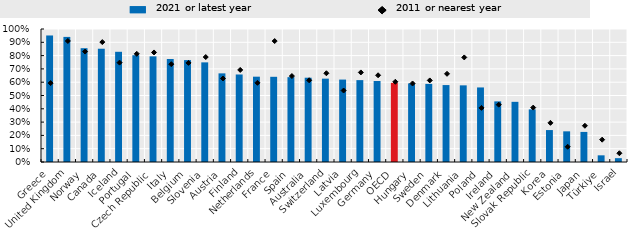
| Category | 2021 or latest year |
|---|---|
| Greece | 0.951 |
| United Kingdom | 0.941 |
| Norway | 0.856 |
| Canada | 0.852 |
| Iceland | 0.829 |
| Portugal | 0.803 |
| Czech Republic | 0.794 |
| Italy | 0.775 |
| Belgium | 0.766 |
| Slovenia | 0.749 |
| Austria | 0.666 |
| Finland | 0.658 |
| Netherlands | 0.642 |
| France | 0.641 |
| Spain | 0.638 |
| Australia | 0.634 |
| Switzerland | 0.627 |
| Latvia | 0.62 |
| Luxembourg | 0.616 |
| Germany | 0.609 |
| OECD | 0.595 |
| Hungary | 0.591 |
| Sweden | 0.587 |
| Denmark | 0.578 |
| Lithuania | 0.576 |
| Poland | 0.561 |
| Ireland | 0.456 |
| New Zealand | 0.452 |
| Slovak Republic | 0.395 |
| Korea | 0.24 |
| Estonia | 0.231 |
| Japan | 0.226 |
| Türkiye | 0.05 |
| Israel | 0.029 |